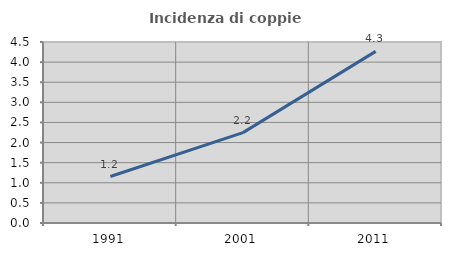
| Category | Incidenza di coppie miste |
|---|---|
| 1991.0 | 1.155 |
| 2001.0 | 2.247 |
| 2011.0 | 4.267 |